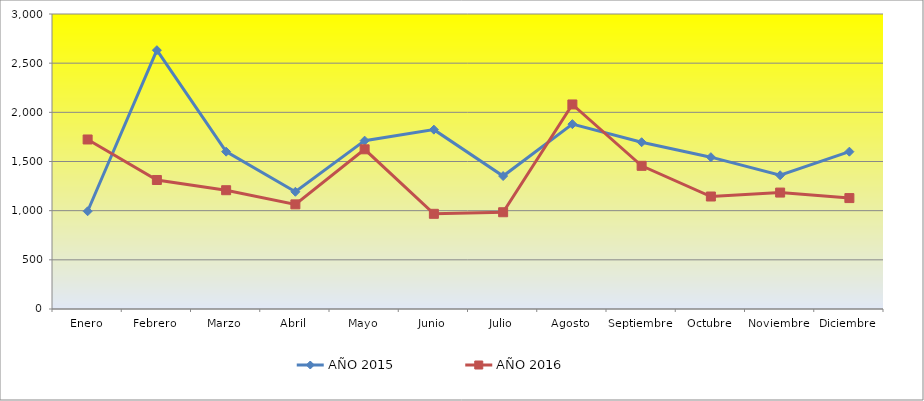
| Category | AÑO 2015 | AÑO 2016 |
|---|---|---|
| Enero | 994 | 1724 |
| Febrero | 2632 | 1312 |
| Marzo | 1600 | 1208 |
| Abril | 1192 | 1064 |
| Mayo | 1712 | 1624 |
| Junio | 1824 | 968 |
| Julio | 1352 | 984 |
| Agosto | 1880 | 2080 |
| Septiembre | 1696 | 1456 |
| Octubre | 1544 | 1144 |
| Noviembre | 1360 | 1184 |
| Diciembre | 1600 | 1128 |